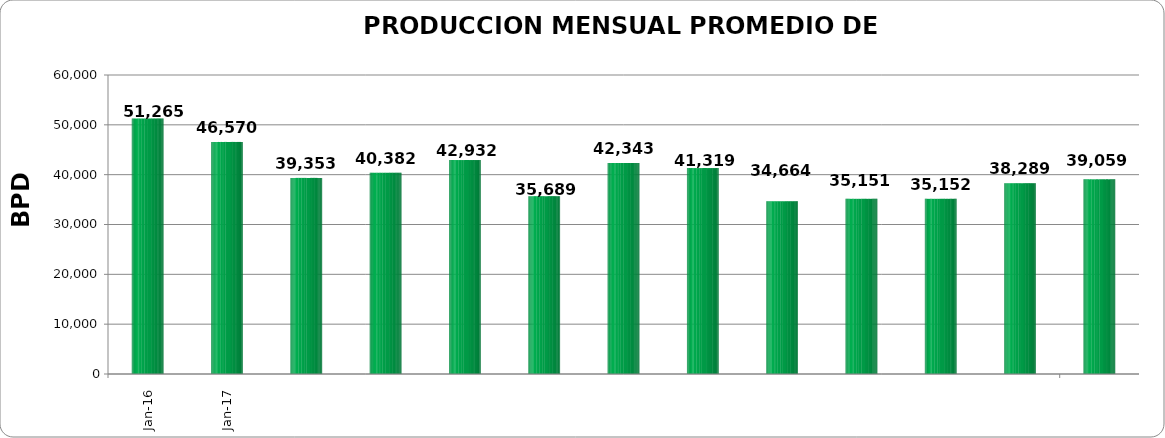
| Category | TOTAL PAIS 
(BPD) #¡REF! #¡REF! #¡REF! #¡REF! #¡REF! #¡REF! #¡REF! #¡REF! #¡REF! #¡REF! #¡REF! #¡REF! #¡REF! #¡REF! #¡REF! #¡REF! #¡REF! #¡REF! #¡REF! #¡REF! #¡REF! #¡REF! #¡REF! #¡REF! #¡REF! #¡REF! #¡REF! #¡REF! #¡REF! #¡REF! #¡REF! #¡REF! #¡REF! #¡REF! |
|---|---|
| 2016-01-01 | 51264.71 |
| 2016-02-01 | 46569.862 |
| 2016-03-01 | 39352.774 |
| 2016-04-01 | 40382 |
| 2016-05-01 | 42932.129 |
| 2016-06-01 | 35689.484 |
| 2016-07-01 | 42342.774 |
| 2016-08-01 | 41318.968 |
| 2016-09-01 | 34664.167 |
| 2016-10-01 | 35151.065 |
| 2016-11-01 | 35152.433 |
| 2016-12-01 | 38288.645 |
| 2017-01-01 | 39058.903 |